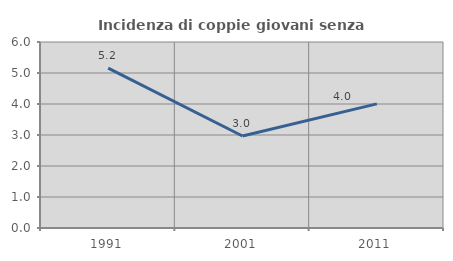
| Category | Incidenza di coppie giovani senza figli |
|---|---|
| 1991.0 | 5.158 |
| 2001.0 | 2.968 |
| 2011.0 | 4.004 |